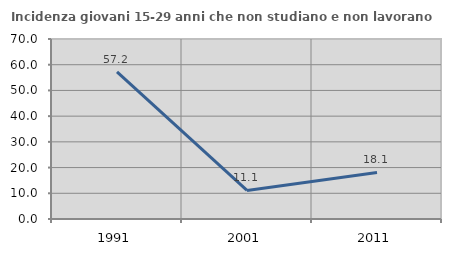
| Category | Incidenza giovani 15-29 anni che non studiano e non lavorano  |
|---|---|
| 1991.0 | 57.199 |
| 2001.0 | 11.111 |
| 2011.0 | 18.116 |